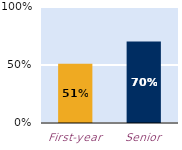
| Category | At least some |
|---|---|
| First-year | 0.51 |
| Senior | 0.704 |